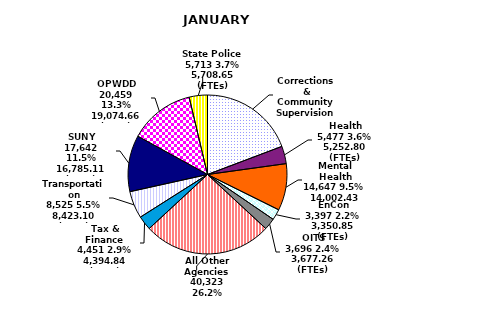
| Category | JANUARY 2019 |
|---|---|
| Corrections & Community Supervision | 29630 |
| Health | 5477 |
| Mental Health | 14647 |
| EnCon | 3397 |
| OITS | 3639 |
| All Other Agencies | 40323 |
| Tax & Finance | 4451 |
| Transportation | 8525 |
| SUNY | 17642 |
| OPWDD | 20459 |
| State Police | 5713 |